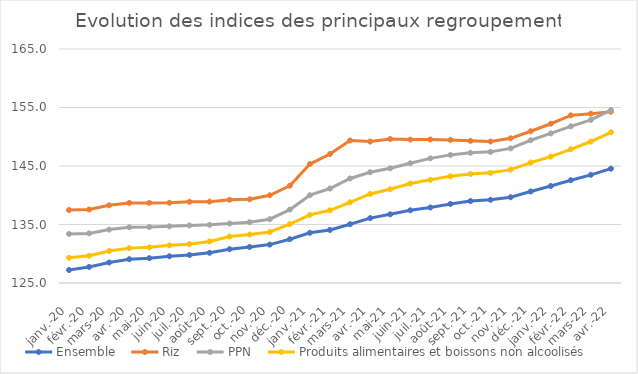
| Category |  Ensemble  |  Riz  |  PPN  |  Produits alimentaires et boissons non alcoolisés  |
|---|---|---|---|---|
| 2020-01-01 | 127.22 | 137.477 | 133.394 | 129.324 |
| 2020-02-01 | 127.747 | 137.571 | 133.482 | 129.658 |
| 2020-03-01 | 128.503 | 138.279 | 134.127 | 130.477 |
| 2020-04-01 | 129.073 | 138.691 | 134.528 | 130.962 |
| 2020-05-01 | 129.246 | 138.695 | 134.553 | 131.1 |
| 2020-06-01 | 129.569 | 138.715 | 134.691 | 131.433 |
| 2020-07-01 | 129.792 | 138.884 | 134.842 | 131.639 |
| 2020-08-01 | 130.165 | 138.908 | 134.939 | 132.108 |
| 2020-09-01 | 130.779 | 139.227 | 135.17 | 132.94 |
| 2020-10-01 | 131.152 | 139.307 | 135.396 | 133.293 |
| 2020-11-01 | 131.562 | 139.996 | 135.904 | 133.717 |
| 2020-12-01 | 132.488 | 141.627 | 137.548 | 135.07 |
| 2021-01-01 | 133.582 | 145.33 | 140.014 | 136.64 |
| 2021-02-01 | 134.068 | 147.047 | 141.147 | 137.422 |
| 2021-03-01 | 135.051 | 149.367 | 142.872 | 138.8 |
| 2021-04-01 | 136.088 | 149.178 | 143.938 | 140.217 |
| 2021-05-01 | 136.75 | 149.619 | 144.606 | 141.028 |
| 2021-06-01 | 137.421 | 149.519 | 145.469 | 142.002 |
| 2021-07-01 | 137.905 | 149.532 | 146.302 | 142.639 |
| 2021-08-01 | 138.51 | 149.461 | 146.899 | 143.242 |
| 2021-09-01 | 139.014 | 149.302 | 147.252 | 143.631 |
| 2021-10-01 | 139.227 | 149.196 | 147.416 | 143.832 |
| 2021-11-01 | 139.66 | 149.736 | 148.006 | 144.381 |
| 2021-12-01 | 140.647 | 150.942 | 149.401 | 145.589 |
| 2022-01-01 | 141.575 | 152.225 | 150.572 | 146.611 |
| 2022-02-01 | 142.565 | 153.658 | 151.785 | 147.854 |
| 2022-03-01 | 143.49 | 153.947 | 152.881 | 149.188 |
| 2022-04-01 | 144.542 | 154.286 | 154.56 | 150.765 |